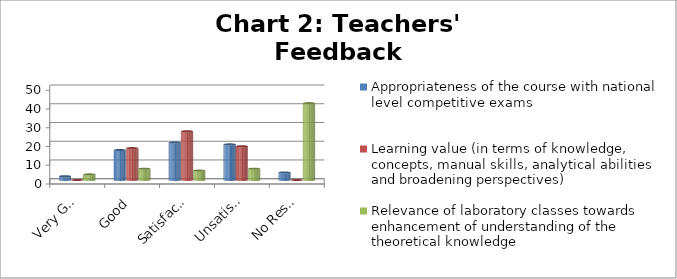
| Category | Appropriateness of the course with national level competitive exams | Learning value (in terms of knowledge, concepts, manual skills, analytical abilities and broadening perspectives) | Relevance of laboratory classes towards enhancement of understanding of the theoretical knowledge |
|---|---|---|---|
| Very Good | 2 | 0 | 3 |
| Good | 16 | 17 | 6 |
| Satisfactory | 20 | 26 | 5 |
| Unsatisfactory | 19 | 18 | 6 |
| No Response | 4 | 0 | 41 |